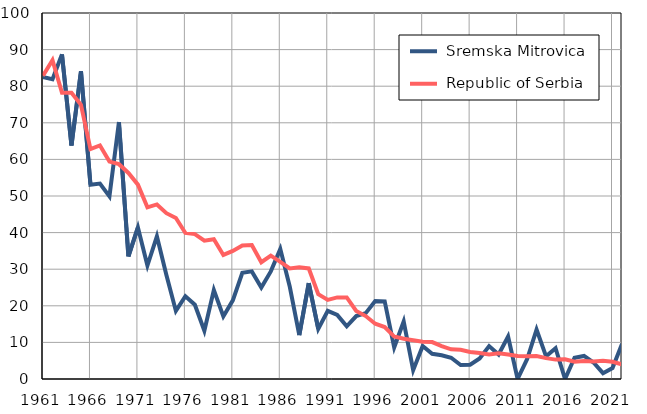
| Category |  Sremska Mitrovica |  Republic of Serbia |
|---|---|---|
| 1961.0 | 82.5 | 82.9 |
| 1962.0 | 81.9 | 87.1 |
| 1963.0 | 88.7 | 78.2 |
| 1964.0 | 63.8 | 78.2 |
| 1965.0 | 84.1 | 74.9 |
| 1966.0 | 53.1 | 62.8 |
| 1967.0 | 53.4 | 63.8 |
| 1968.0 | 49.9 | 59.4 |
| 1969.0 | 70.2 | 58.7 |
| 1970.0 | 33.5 | 56.3 |
| 1971.0 | 41.4 | 53.1 |
| 1972.0 | 31 | 46.9 |
| 1973.0 | 39 | 47.7 |
| 1974.0 | 28.4 | 45.3 |
| 1975.0 | 18.6 | 44 |
| 1976.0 | 22.6 | 39.9 |
| 1977.0 | 20.3 | 39.6 |
| 1978.0 | 13.2 | 37.8 |
| 1979.0 | 24.3 | 38.2 |
| 1980.0 | 17.1 | 33.9 |
| 1981.0 | 21.5 | 35 |
| 1982.0 | 29 | 36.5 |
| 1983.0 | 29.4 | 36.6 |
| 1984.0 | 25 | 31.9 |
| 1985.0 | 29.4 | 33.7 |
| 1986.0 | 35.5 | 32 |
| 1987.0 | 25.2 | 30.2 |
| 1988.0 | 12 | 30.5 |
| 1989.0 | 26.2 | 30.2 |
| 1990.0 | 13.7 | 23.2 |
| 1991.0 | 18.6 | 21.6 |
| 1992.0 | 17.5 | 22.3 |
| 1993.0 | 14.4 | 22.3 |
| 1994.0 | 17.2 | 18.6 |
| 1995.0 | 18 | 17.2 |
| 1996.0 | 21.3 | 15.1 |
| 1997.0 | 21.2 | 14.2 |
| 1998.0 | 8.6 | 11.6 |
| 1999.0 | 15.7 | 11 |
| 2000.0 | 2.4 | 10.6 |
| 2001.0 | 9 | 10.2 |
| 2002.0 | 6.9 | 10.1 |
| 2003.0 | 6.5 | 9 |
| 2004.0 | 5.8 | 8.1 |
| 2005.0 | 3.8 | 8 |
| 2006.0 | 3.9 | 7.4 |
| 2007.0 | 5.6 | 7.1 |
| 2008.0 | 9 | 6.7 |
| 2009.0 | 6.7 | 7 |
| 2010.0 | 11.6 | 6.7 |
| 2011.0 | 0 | 6.3 |
| 2012.0 | 5.4 | 6.2 |
| 2013.0 | 13.5 | 6.3 |
| 2014.0 | 6.2 | 5.7 |
| 2015.0 | 8.4 | 5.3 |
| 2016.0 | 0 | 5.4 |
| 2017.0 | 5.8 | 4.7 |
| 2018.0 | 6.3 | 4.9 |
| 2019.0 | 4.5 | 4.8 |
| 2020.0 | 1.6 | 5 |
| 2021.0 | 3 | 4.7 |
| 2022.0 | 9.6 | 4 |